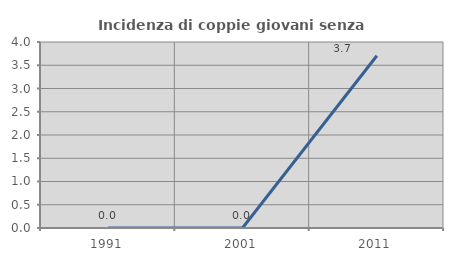
| Category | Incidenza di coppie giovani senza figli |
|---|---|
| 1991.0 | 0 |
| 2001.0 | 0 |
| 2011.0 | 3.704 |